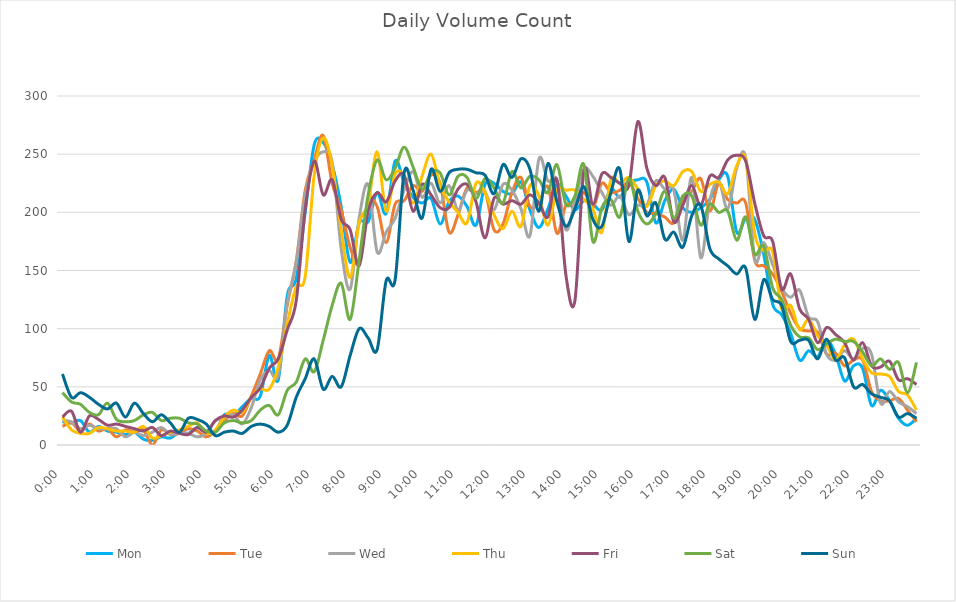
| Category | Mon | Tue | Wed | Thu | Fri | Sat | Sun |
|---|---|---|---|---|---|---|---|
| 0.0 | 20 | 16 | 21 | 24 | 24 | 45 | 61 |
| 0.010416666666666666 | 19 | 19 | 20 | 13 | 29 | 37 | 41 |
| 0.020833333333333332 | 21 | 12 | 14 | 10 | 11 | 35 | 45 |
| 0.03125 | 11 | 18 | 17 | 10 | 25 | 28 | 41 |
| 0.041666666666666664 | 16 | 12 | 14 | 15 | 22 | 26 | 35 |
| 0.05208333333333333 | 12 | 14 | 14 | 14 | 17 | 36 | 31 |
| 0.06249999999999999 | 11 | 7 | 14 | 12 | 18 | 22 | 36 |
| 0.07291666666666666 | 9 | 13 | 7 | 12 | 16 | 20 | 24 |
| 0.08333333333333333 | 11 | 11 | 11 | 11 | 14 | 21 | 36 |
| 0.09375 | 5 | 13 | 8 | 16 | 12 | 26 | 27 |
| 0.10416666666666667 | 4 | 0 | 11 | 6 | 15 | 28 | 20 |
| 0.11458333333333334 | 7 | 13 | 15 | 8 | 8 | 21 | 26 |
| 0.125 | 6 | 9 | 9 | 11 | 12 | 23 | 19 |
| 0.13541666666666666 | 11 | 10 | 10 | 13 | 10 | 23 | 11 |
| 0.14583333333333331 | 10 | 14 | 10 | 16 | 9 | 19 | 23 |
| 0.15624999999999997 | 15 | 12 | 7 | 19 | 15 | 18 | 22 |
| 0.16666666666666663 | 11 | 7 | 10 | 10 | 11 | 12 | 18 |
| 0.1770833333333333 | 11 | 12 | 21 | 13 | 21 | 11 | 8 |
| 0.18749999999999994 | 26 | 21 | 23 | 24 | 25 | 19 | 11 |
| 0.1979166666666666 | 25 | 27 | 26 | 30 | 24 | 21 | 12 |
| 0.20833333333333326 | 33 | 25 | 18 | 28 | 30 | 19 | 10 |
| 0.21874999999999992 | 40 | 42 | 32 | 41 | 41 | 21 | 16 |
| 0.22916666666666657 | 42 | 61 | 56 | 48 | 49 | 30 | 18 |
| 0.23958333333333323 | 77 | 81 | 64 | 48 | 66 | 34 | 16 |
| 0.2499999999999999 | 56 | 74 | 60 | 67 | 74 | 26 | 11 |
| 0.2604166666666666 | 128 | 120 | 122 | 104 | 99 | 47 | 17 |
| 0.27083333333333326 | 143 | 158 | 157 | 136 | 124 | 54 | 41 |
| 0.28124999999999994 | 200 | 219 | 215 | 145 | 203 | 74 | 57 |
| 0.29166666666666663 | 258 | 245 | 243 | 232 | 244 | 63 | 74 |
| 0.3020833333333333 | 260 | 266 | 252 | 264 | 215 | 90 | 48 |
| 0.3125 | 241 | 225 | 243 | 240 | 228 | 120 | 59 |
| 0.3229166666666667 | 205 | 202 | 169 | 185 | 194 | 139 | 50 |
| 0.33333333333333337 | 157 | 170 | 134 | 144 | 185 | 108 | 77 |
| 0.34375000000000006 | 191 | 157 | 195 | 191 | 154 | 159 | 100 |
| 0.35416666666666674 | 192 | 207 | 224 | 207 | 201 | 215 | 92 |
| 0.3645833333333334 | 217 | 205 | 166 | 252 | 217 | 245 | 82 |
| 0.3750000000000001 | 199 | 174 | 183 | 201 | 209 | 228 | 141 |
| 0.3854166666666668 | 244 | 207 | 195 | 233 | 227 | 238 | 142 |
| 0.3958333333333335 | 226 | 210 | 219 | 231 | 232 | 256 | 234 |
| 0.40625000000000017 | 213 | 223 | 235 | 208 | 201 | 239 | 219 |
| 0.41666666666666685 | 208 | 218 | 213 | 231 | 224 | 220 | 195 |
| 0.4270833333333333 | 212 | 232 | 225 | 250 | 215 | 234 | 237 |
| 0.4375000000000002 | 190 | 225 | 208 | 223 | 204 | 234 | 218 |
| 0.4479166666666669 | 209 | 183 | 223 | 209 | 204 | 215 | 234 |
| 0.4583333333333333 | 214 | 198 | 202 | 200 | 220 | 231 | 237 |
| 0.4687500000000003 | 205 | 221 | 219 | 191 | 224 | 230 | 237 |
| 0.47916666666666696 | 189 | 217 | 216 | 225 | 209 | 212 | 234 |
| 0.4895833333333333 | 224 | 218 | 217 | 217 | 178 | 229 | 232 |
| 0.5000000000000003 | 225 | 185 | 202 | 198 | 212 | 221 | 216 |
| 0.510416666666667 | 218 | 190 | 224 | 186 | 207 | 208 | 241 |
| 0.5208333333333334 | 216 | 217 | 219 | 201 | 210 | 235 | 230 |
| 0.5312500000000002 | 226 | 230 | 203 | 188 | 207 | 221 | 246 |
| 0.5416666666666669 | 202 | 205 | 180 | 223 | 215 | 231 | 237 |
| 0.5520833333333335 | 187 | 208 | 246 | 214 | 208 | 228 | 201 |
| 0.5625000000000001 | 203 | 222 | 227 | 189 | 196 | 217 | 242 |
| 0.5729166666666667 | 224 | 182 | 228 | 219 | 228 | 241 | 209 |
| 0.5833333333333334 | 214 | 206 | 185 | 219 | 146 | 207 | 188 |
| 0.59375 | 202 | 205 | 209 | 219 | 124 | 214 | 203 |
| 0.6041666666666666 | 210 | 217 | 237 | 211 | 236 | 241 | 222 |
| 0.6145833333333333 | 207 | 204 | 231 | 203 | 207 | 175 | 194 |
| 0.6249999999999999 | 202 | 225 | 217 | 183 | 233 | 204 | 188 |
| 0.6354166666666665 | 220 | 217 | 206 | 228 | 230 | 211 | 217 |
| 0.6458333333333331 | 213 | 219 | 214 | 225 | 225 | 196 | 237 |
| 0.6562499999999998 | 225 | 226 | 198 | 230 | 223 | 229 | 175 |
| 0.6666666666666666 | 228 | 212 | 206 | 220 | 278 | 201 | 219 |
| 0.677083333333333 | 226 | 200 | 206 | 205 | 238 | 190 | 197 |
| 0.6874999999999997 | 191 | 199 | 227 | 223 | 223 | 199 | 208 |
| 0.6979166666666666 | 210 | 196 | 220 | 227 | 230 | 218 | 177 |
| 0.7083333333333329 | 220 | 191 | 219 | 223 | 192 | 195 | 183 |
| 0.7187499999999996 | 204 | 212 | 176 | 235 | 206 | 214 | 170 |
| 0.7291666666666666 | 200 | 218 | 230 | 235 | 223 | 214 | 197 |
| 0.7395833333333328 | 204 | 229 | 161 | 218 | 206 | 189 | 206 |
| 0.75 | 211 | 201 | 210 | 224 | 231 | 207 | 169 |
| 0.7604166666666666 | 228 | 225 | 227 | 226 | 230 | 200 | 160 |
| 0.7708333333333327 | 231 | 211 | 203 | 216 | 245 | 201 | 154 |
| 0.78125 | 183 | 208 | 238 | 240 | 249 | 176 | 147 |
| 0.7916666666666666 | 195 | 208 | 247 | 246 | 244 | 196 | 152 |
| 0.8020833333333326 | 194 | 159 | 160 | 182 | 208 | 164 | 108 |
| 0.8125 | 164 | 154 | 174 | 167 | 180 | 171 | 142 |
| 0.8229166666666666 | 121 | 147 | 155 | 166 | 175 | 135 | 125 |
| 0.8333333333333334 | 112 | 132 | 135 | 117 | 134 | 125 | 120 |
| 0.84375 | 96 | 113 | 127 | 120 | 147 | 103 | 89 |
| 0.8541666666666666 | 73 | 100 | 133 | 99 | 117 | 93 | 90 |
| 0.8645833333333334 | 81 | 98 | 110 | 108 | 108 | 92 | 90 |
| 0.875 | 76 | 97 | 106 | 94 | 88 | 82 | 74 |
| 0.8854166666666666 | 90 | 78 | 78 | 86 | 101 | 87 | 91 |
| 0.8958333333333334 | 78 | 79 | 73 | 73 | 95 | 91 | 73 |
| 0.90625 | 55 | 68 | 81 | 86 | 88 | 89 | 75 |
| 0.9166666666666666 | 68 | 73 | 74 | 91 | 73 | 89 | 50 |
| 0.9270833333333334 | 66 | 73 | 83 | 74 | 88 | 80 | 52 |
| 0.9375 | 34 | 46 | 78 | 62 | 68 | 68 | 44 |
| 0.9479166666666666 | 47 | 38 | 36 | 61 | 67 | 74 | 41 |
| 0.9583333333333334 | 38 | 38 | 46 | 59 | 72 | 65 | 38 |
| 0.96875 | 23 | 40 | 37 | 46 | 56 | 71 | 24 |
| 0.9791666666666666 | 17 | 30 | 33 | 43 | 57 | 45 | 27 |
| 0.9895833333333334 | 23 | 20 | 27 | 30 | 52 | 71 | 23 |